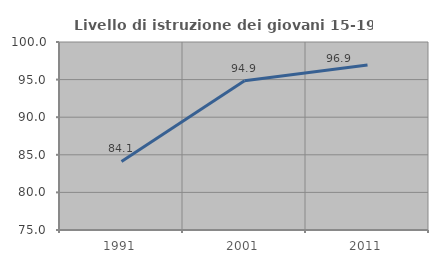
| Category | Livello di istruzione dei giovani 15-19 anni |
|---|---|
| 1991.0 | 84.12 |
| 2001.0 | 94.857 |
| 2011.0 | 96.933 |